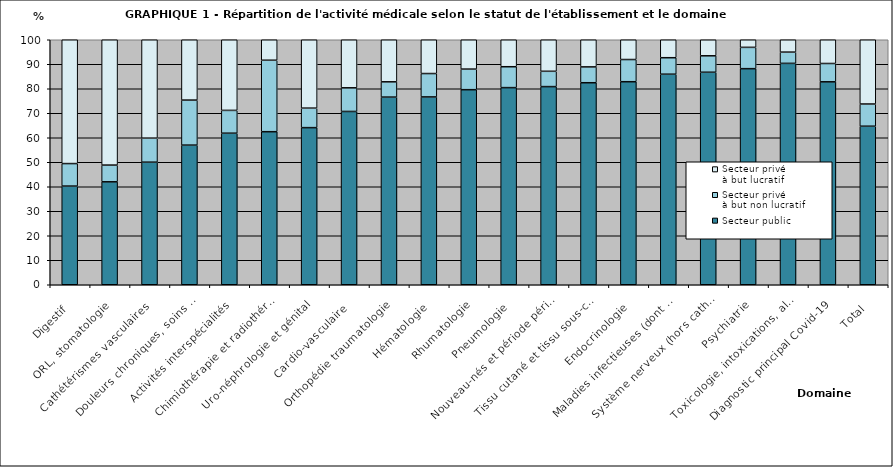
| Category | Secteur public | Secteur privé
à but non lucratif | Secteur privé
à but lucratif |
|---|---|---|---|
| Digestif | 40.27 | 9.19 | 50.54 |
| ORL, stomatologie | 42.01 | 6.83 | 51.16 |
| Cathétérismes vasculaires  | 50.03 | 9.81 | 40.16 |
| Douleurs chroniques, soins palliatifs | 56.99 | 18.38 | 24.63 |
| Activités interspécialités | 61.86 | 9.31 | 28.83 |
| Chimiothérapie et radiothérapie, hors séances | 62.47 | 29.17 | 8.36 |
| Uro-néphrologie et génital | 64.13 | 7.96 | 27.91 |
| Cardio-vasculaire  | 70.73 | 9.65 | 19.63 |
| Orthopédie traumatologie | 76.59 | 6.24 | 17.17 |
| Hématologie | 76.66 | 9.55 | 13.79 |
| Rhumatologie | 79.62 | 8.4 | 11.99 |
| Pneumologie | 80.46 | 8.53 | 11.01 |
| Nouveau-nés et période périnatale | 80.88 | 6.25 | 12.87 |
| Tissu cutané et tissu sous-cutané | 82.46 | 6.46 | 11.08 |
| Endocrinologie | 82.87 | 9.06 | 8.07 |
| Maladies infectieuses (dont VIH) | 85.94 | 6.73 | 7.33 |
| Système nerveux (hors cathétérismes vasculaires diagnostiques et interventionnels) | 86.74 | 6.71 | 6.54 |
| Psychiatrie | 88.2 | 8.7 | 3.11 |
| Toxicologie, intoxications, alcool | 90.36 | 4.59 | 5.05 |
| Diagnostic principal Covid-19 | 82.83 | 7.48 | 9.69 |
| Total | 64.71 | 9.06 | 26.23 |